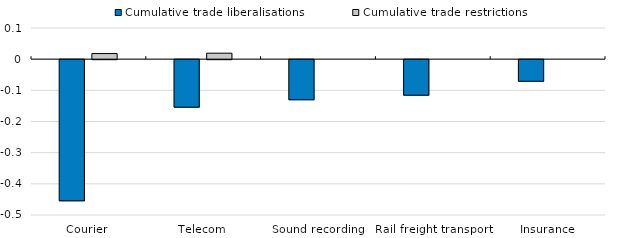
| Category | Cumulative trade liberalisations | Cumulative trade restrictions |
|---|---|---|
| Courier | -0.453 | 0.018 |
| Telecom | -0.152 | 0.019 |
| Sound recording | -0.129 | 0 |
| Rail freight transport | -0.114 | 0 |
| Insurance | -0.069 | 0 |